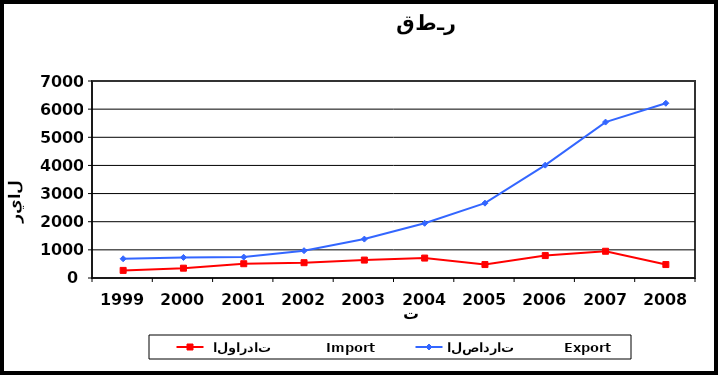
| Category |  الواردات           Import | الصادرات          Export |
|---|---|---|
| 1999.0 | 270 | 683 |
| 2000.0 | 349 | 731 |
| 2001.0 | 507 | 743 |
| 2002.0 | 544 | 970 |
| 2003.0 | 637 | 1383 |
| 2004.0 | 708 | 1944 |
| 2005.0 | 478 | 2659 |
| 2006.0 | 797 | 4010 |
| 2007.0 | 950 | 5540 |
| 2008.0 | 478 | 6209 |